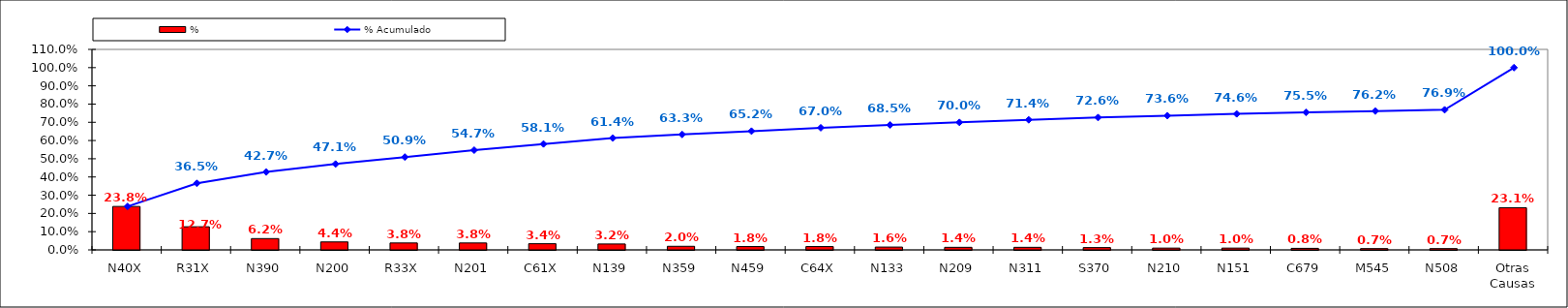
| Category | % |
|---|---|
| N40X | 0.238 |
| R31X | 0.127 |
| N390 | 0.062 |
| N200 | 0.044 |
| R33X | 0.038 |
| N201 | 0.038 |
| C61X | 0.034 |
| N139 | 0.032 |
| N359 | 0.02 |
| N459 | 0.018 |
| C64X | 0.018 |
| N133 | 0.016 |
| N209 | 0.014 |
| N311 | 0.014 |
| S370 | 0.013 |
| N210 | 0.01 |
| N151 | 0.01 |
| C679 | 0.008 |
| M545 | 0.007 |
| N508 | 0.007 |
| Otras Causas | 0.231 |